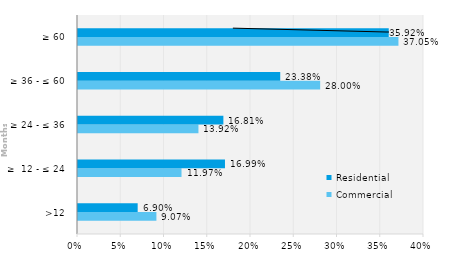
| Category | Commercial | Residential |
|---|---|---|
| >12 | 0.091 | 0.069 |
| ≥  12 - ≤ 24 | 0.12 | 0.17 |
| ≥ 24 - ≤ 36 | 0.139 | 0.168 |
| ≥ 36 - ≤ 60 | 0.28 | 0.234 |
| ≥ 60 | 0.37 | 0.359 |